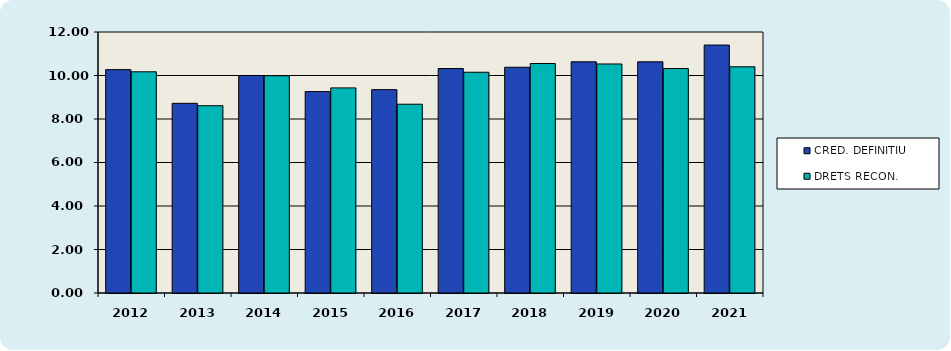
| Category | CRED. DEFINITIU | DRETS RECON. |
|---|---|---|
| 2012.0 | 10.27 | 10.17 |
| 2013.0 | 8.72 | 8.61 |
| 2014.0 | 10 | 9.99 |
| 2015.0 | 9.26 | 9.43 |
| 2016.0 | 9.35 | 8.68 |
| 2017.0 | 10.32 | 10.15 |
| 2018.0 | 10.38 | 10.55 |
| 2019.0 | 10.63 | 10.53 |
| 2020.0 | 10.63 | 10.32 |
| 2021.0 | 11.4 | 10.4 |